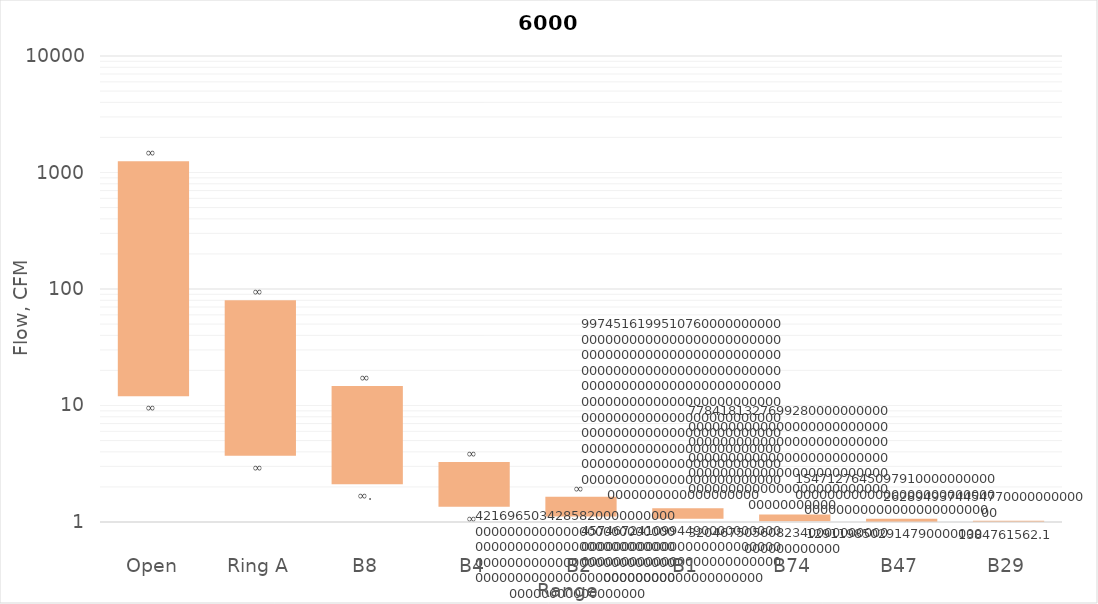
| Category | min Flow, CFM | Series 2 | max Flow, CFM |
|---|---|---|---|
| Open | 2722.417 | 5021.78 | 7744.197 |
| Ring A | 1444.268 | 3315.848 | 4760.116 |
| B8 | 830.139 | 2086.895 | 2917.034 |
| B4 | 347.944 | 940.12 | 1288.063 |
| B2 | 141.625 | 399.266 | 540.891 |
| B1 | 94.66 | 199.339 | 293.999 |
| B74 | 36.506 | 124.385 | 160.891 |
| B47 | 21.111 | 51.079 | 72.19 |
| B29 | 9.141 | 17.278 | 26.42 |